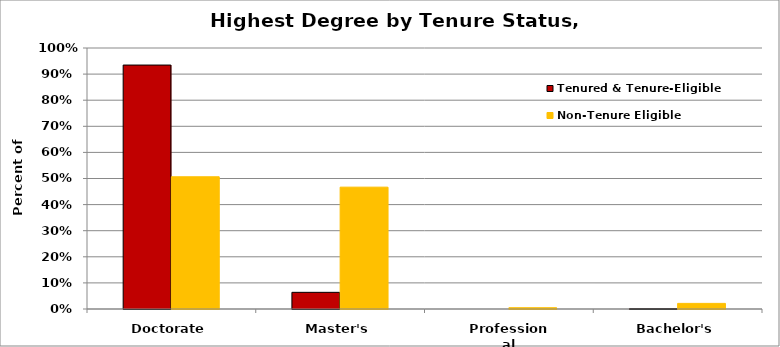
| Category | Tenured & Tenure-Eligible | Non-Tenure Eligible |
|---|---|---|
| Doctorate | 0.935 | 0.507 |
| Master's | 0.064 | 0.467 |
| Professional | 0 | 0.005 |
| Bachelor's | 0.001 | 0.022 |